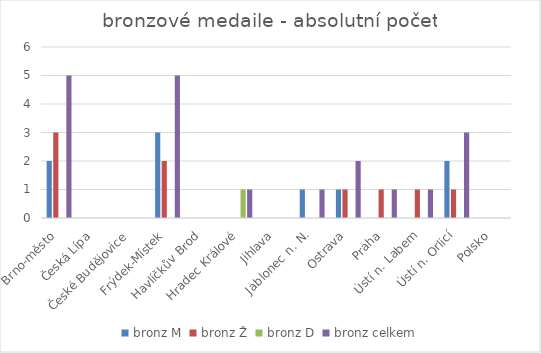
| Category | bronz M | bronz Ž | bronz D | bronz celkem |
|---|---|---|---|---|
| Brno-město | 2 | 3 | 0 | 5 |
| Česká Lípa | 0 | 0 | 0 | 0 |
| České Budějovice | 0 | 0 | 0 | 0 |
| Frýdek-Místek | 3 | 2 | 0 | 5 |
| Havlíčkův Brod | 0 | 0 | 0 | 0 |
| Hradec Králové | 0 | 0 | 1 | 1 |
| Jihlava | 0 | 0 | 0 | 0 |
| Jablonec n. N. | 1 | 0 | 0 | 1 |
| Ostrava | 1 | 1 | 0 | 2 |
| Praha | 0 | 1 | 0 | 1 |
| Ústí n. Labem | 0 | 1 | 0 | 1 |
| Ústí n. Orlicí | 2 | 1 | 0 | 3 |
| Polsko | 0 | 0 | 0 | 0 |